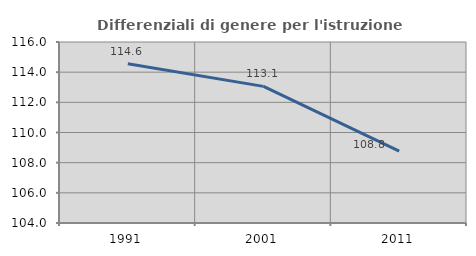
| Category | Differenziali di genere per l'istruzione superiore |
|---|---|
| 1991.0 | 114.56 |
| 2001.0 | 113.058 |
| 2011.0 | 108.759 |